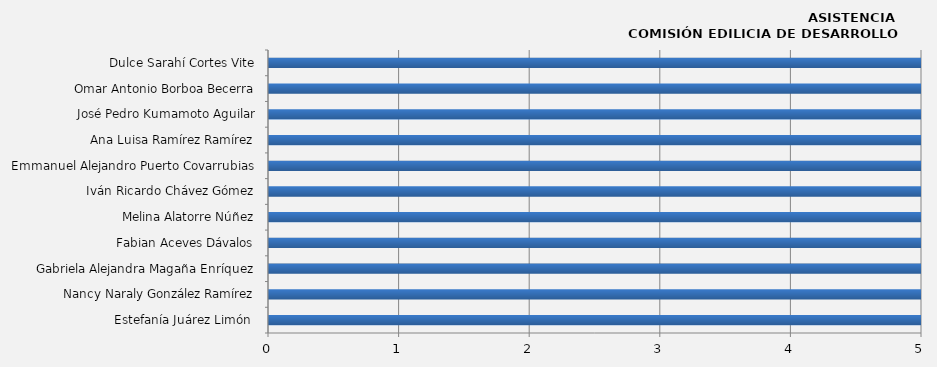
| Category | Estefanía Juárez Limón  |
|---|---|
| Estefanía Juárez Limón  | 15 |
| Nancy Naraly González Ramírez | 15 |
| Gabriela Alejandra Magaña Enríquez | 14 |
| Fabian Aceves Dávalos | 15 |
| Melina Alatorre Núñez | 10 |
| Iván Ricardo Chávez Gómez | 11 |
| Emmanuel Alejandro Puerto Covarrubias | 11 |
| Ana Luisa Ramírez Ramírez | 14 |
| José Pedro Kumamoto Aguilar | 13 |
| Omar Antonio Borboa Becerra | 10 |
| Dulce Sarahí Cortes Vite | 11 |